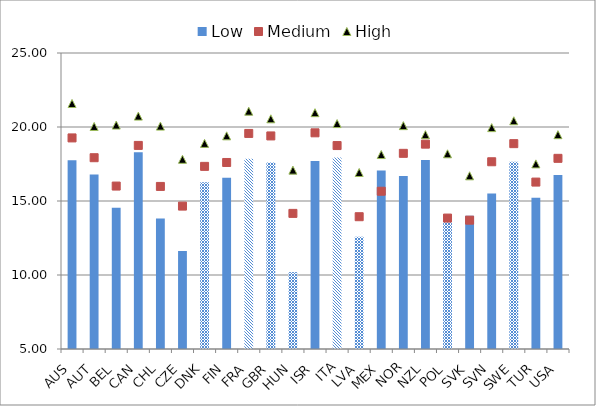
| Category | Low |
|---|---|
| AUS | 17.748 |
| AUT | 16.786 |
| BEL | 14.542 |
| CAN | 18.3 |
| CHL | 13.816 |
| CZE | 11.63 |
| DNK | 16.263 |
| FIN | 16.566 |
| FRA | 17.86 |
| GBR | 17.608 |
| HUN | 10.194 |
| ISR | 17.703 |
| ITA | 17.933 |
| LVA | 12.59 |
| MEX | 17.064 |
| NOR | 16.684 |
| NZL | 17.769 |
| POL | 13.643 |
| SVK | 14.008 |
| SVN | 15.511 |
| SWE | 17.646 |
| TUR | 15.221 |
| USA | 16.755 |